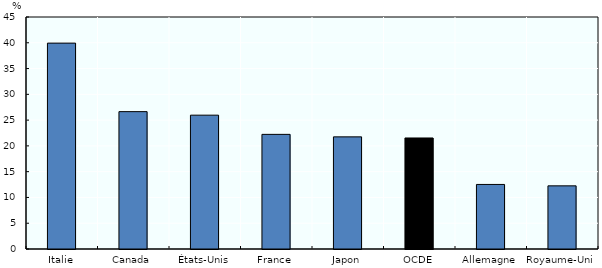
| Category | Series 0 |
|---|---|
| Italie | 39.936 |
| Canada | 26.644 |
| États-Unis | 25.96 |
| France | 22.235 |
| Japon | 21.751 |
| OCDE | 21.534 |
| Allemagne | 12.521 |
| Royaume-Uni | 12.249 |